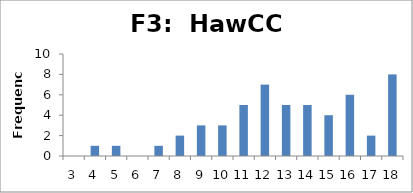
| Category | Frequency |
|---|---|
| 3.0 | 0 |
| 4.0 | 1 |
| 5.0 | 1 |
| 6.0 | 0 |
| 7.0 | 1 |
| 8.0 | 2 |
| 9.0 | 3 |
| 10.0 | 3 |
| 11.0 | 5 |
| 12.0 | 7 |
| 13.0 | 5 |
| 14.0 | 5 |
| 15.0 | 4 |
| 16.0 | 6 |
| 17.0 | 2 |
| 18.0 | 8 |